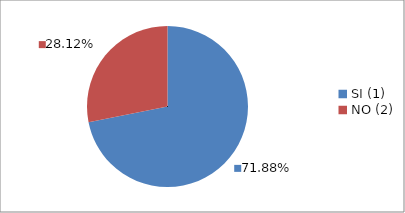
| Category | Series 0 |
|---|---|
| SI (1) | 0.719 |
| NO (2) | 0.281 |